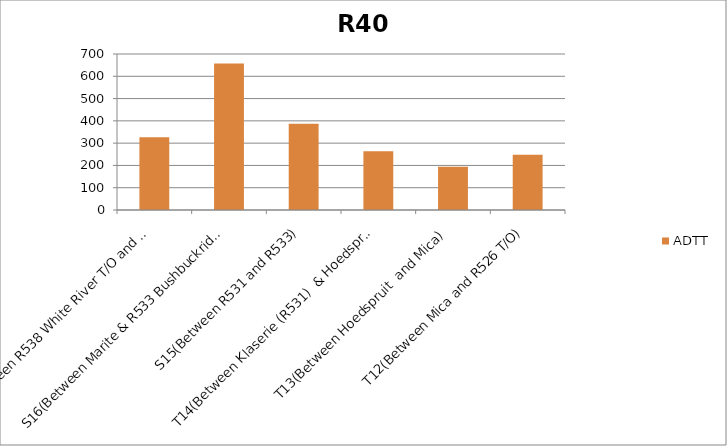
| Category | ADTT |
|---|---|
| T17(Between R538 White River T/O and R537 Hazyview) | 325.888 |
| S16(Between Marite & R533 Bushbuckridge) | 657.211 |
| S15(Between R531 and R533) | 387.484 |
| T14(Between Klaserie (R531)  & Hoedspruit) | 263.067 |
| T13(Between Hoedspruit  and Mica) | 193.828 |
| T12(Between Mica and R526 T/O) | 248.313 |